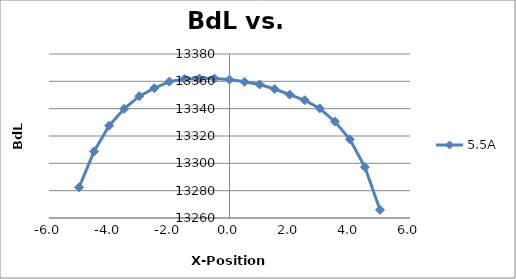
| Category | 5.5A |
|---|---|
| -5.0 | 13282.454 |
| -4.501999999999999 | 13308.641 |
| -4.001999999999999 | 13327.523 |
| -3.501999999999999 | 13339.865 |
| -3.0009999999999994 | 13349.155 |
| -2.5009999999999994 | 13354.943 |
| -2.0009999999999994 | 13359.82 |
| -1.5009999999999994 | 13361.743 |
| -1.0009999999999994 | 13362.08 |
| -0.5010000000000012 | 13362.067 |
| -0.0010000000000012221 | 13361.289 |
| 0.5 | 13359.623 |
| 1.0 | 13357.684 |
| 1.5 | 13354.367 |
| 2.0 | 13350.251 |
| 2.5 | 13346.159 |
| 3.0 | 13340.181 |
| 3.5010000000000012 | 13330.612 |
| 4.001000000000001 | 13317.554 |
| 4.501000000000001 | 13297.28 |
| 5.001000000000001 | 13265.963 |